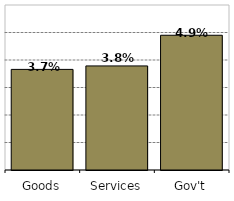
| Category | Series 0 |
|---|---|
| Goods | 0.037 |
| Services | 0.038 |
| Gov't | 0.049 |